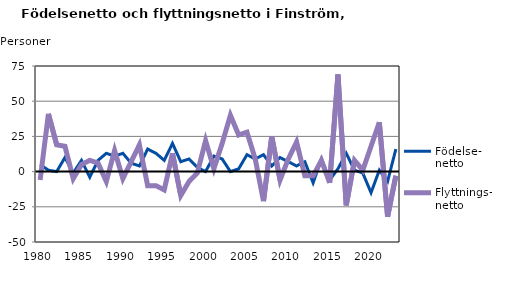
| Category | Födelse- netto | Flyttnings- netto |
|---|---|---|
| 1980.0 | 5 | -6 |
| 1981.0 | 1 | 41 |
| 1982.0 | 0 | 19 |
| 1983.0 | 10 | 18 |
| 1984.0 | -1 | -5 |
| 1985.0 | 8 | 5 |
| 1986.0 | -4 | 8 |
| 1987.0 | 8 | 6 |
| 1988.0 | 13 | -7 |
| 1989.0 | 11 | 15 |
| 1990.0 | 13 | -5 |
| 1991.0 | 6 | 7 |
| 1992.0 | 4 | 19 |
| 1993.0 | 16 | -10 |
| 1994.0 | 13 | -10 |
| 1995.0 | 8 | -13 |
| 1996.0 | 20 | 13 |
| 1997.0 | 7 | -17 |
| 1998.0 | 9 | -7 |
| 1999.0 | 3 | -1 |
| 2000.0 | 0 | 22 |
| 2001.0 | 11 | 2 |
| 2002.0 | 9 | 20 |
| 2003.0 | 0 | 40 |
| 2004.0 | 2 | 26 |
| 2005.0 | 12 | 28 |
| 2006.0 | 9 | 9 |
| 2007.0 | 12 | -21 |
| 2008.0 | 4 | 25 |
| 2009.0 | 10 | -6 |
| 2010.0 | 7 | 9 |
| 2011.0 | 4 | 21 |
| 2012.0 | 7 | -3 |
| 2013.0 | -8 | -3 |
| 2014.0 | 9 | 8 |
| 2015.0 | -6 | -8 |
| 2016.0 | 2 | 69 |
| 2017.0 | 13 | -24 |
| 2018.0 | 1 | 8 |
| 2019.0 | -1 | 1 |
| 2020.0 | -15 | 18 |
| 2021.0 | 1 | 35 |
| 2022.0 | -7 | -32 |
| 2023.0 | 16 | -3 |